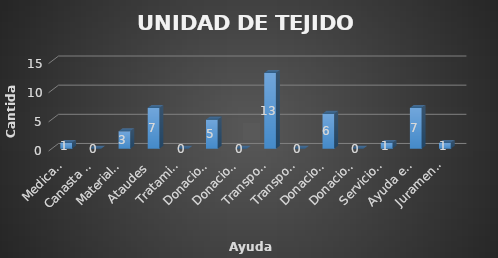
| Category | UNIDAD DE TEJIDO SOCIAL  |
|---|---|
| Medicamentos | 1 |
| Canasta basica | 0 |
| Materiales de construcion | 3 |
| Ataudes | 7 |
| Tratamiento medicos | 0 |
| Donaciones a ADESCO | 5 |
| Donaciones a Escuelas (pintura) | 0 |
| Transporte a instituciones  | 13 |
| Transportes (consulta a centros de salud) | 0 |
| Donaciones a otras Instituciones  | 6 |
| Donacion de laminas | 0 |
| Servicios funerarios | 1 |
| Ayuda economica. | 7 |
| Juramentacion de ADESCOS  | 1 |